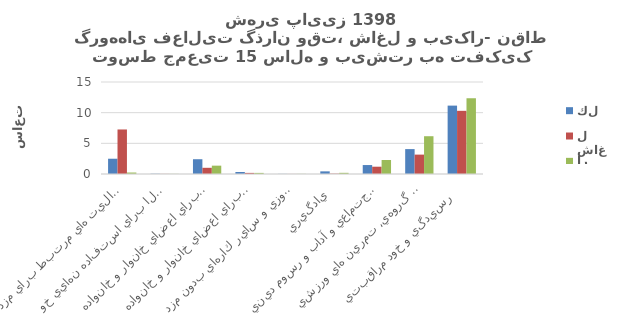
| Category | كل | شاغل | بيكار |
|---|---|---|---|
| اشتغال و فعاليت هاي مرتبط براي مزد  | 2.49 | 7.26 | 0.24 |
| توليد كالا براي استفاده نهايي خود   | 0.04 | 0.02 | 0.02 |
| خدمات خانگي بدون مزد براي اعضاي خانوار و خانواده   | 2.41 | 1.01 | 1.36 |
| خدمات مراقبتي بدون مزد براي اعضاي خانوار و خانواده   | 0.33 | 0.18 | 0.18 |
| كارداوطلبانه بدون مزد، كار آموزي و ساير كارهاي بدون مزد  | 0.02 | 0.01 | 0.02 |
| يادگيري  | 0.43 | 0.06 | 0.19 |
| معاشرت، ارتباط، مشاركت اجتماعي و آداب و رسوم ديني  | 1.46 | 1.19 | 2.28 |
| فرهنگ، فراغت، رسانه هاي گروهي، تمرين هاي ورزشي  | 4.06 | 3.16 | 6.16 |
| رسيدگي و خود مراقبتي   | 11.15 | 10.3 | 12.35 |